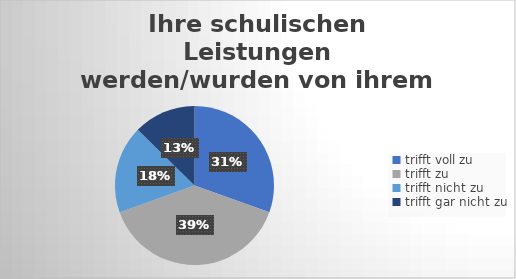
| Category | Ihre schulischen Leistungen werden/wurden von ihrem sozialen Umfeld unterstützt.  |
|---|---|
| trifft voll zu | 82 |
| trifft zu  | 105 |
| trifft nicht zu  | 48 |
| trifft gar nicht zu | 34 |